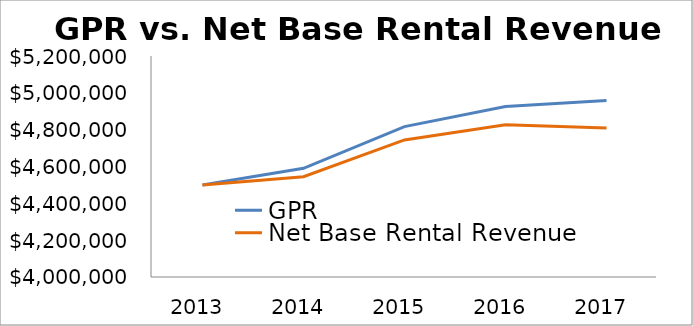
| Category | GPR | Net Base Rental Revenue |
|---|---|---|
| 2013.0 | 4500000 | 4500000 |
| 2014.0 | 4590127 | 4544225.73 |
| 2015.0 | 4816605 | 4744355.925 |
| 2016.0 | 4925280 | 4826774.4 |
| 2017.0 | 4958280 | 4809530.6 |